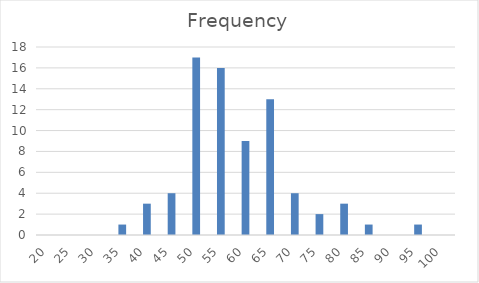
| Category | Frequency |
|---|---|
| 20.0 | 0 |
| 25.0 | 0 |
| 30.0 | 0 |
| 35.0 | 1 |
| 40.0 | 3 |
| 45.0 | 4 |
| 50.0 | 17 |
| 55.0 | 16 |
| 60.0 | 9 |
| 65.0 | 13 |
| 70.0 | 4 |
| 75.0 | 2 |
| 80.0 | 3 |
| 85.0 | 1 |
| 90.0 | 0 |
| 95.0 | 1 |
| 100.0 | 0 |